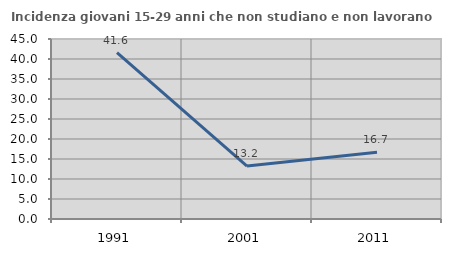
| Category | Incidenza giovani 15-29 anni che non studiano e non lavorano  |
|---|---|
| 1991.0 | 41.582 |
| 2001.0 | 13.239 |
| 2011.0 | 16.667 |